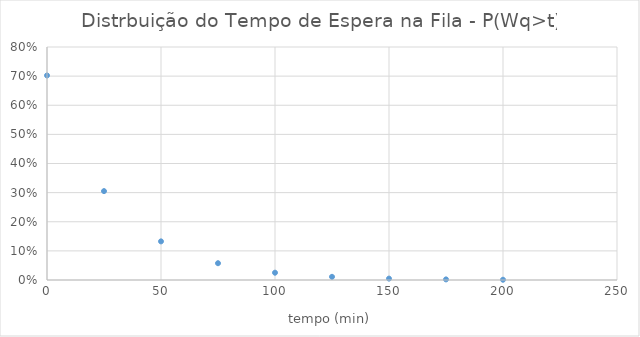
| Category | Series 0 |
|---|---|
| 0.0 | 0.702 |
| 25.0 | 0.305 |
| 50.0 | 0.133 |
| 75.0 | 0.058 |
| 100.0 | 0.025 |
| 125.0 | 0.011 |
| 150.0 | 0.005 |
| 175.0 | 0.002 |
| 200.0 | 0.001 |